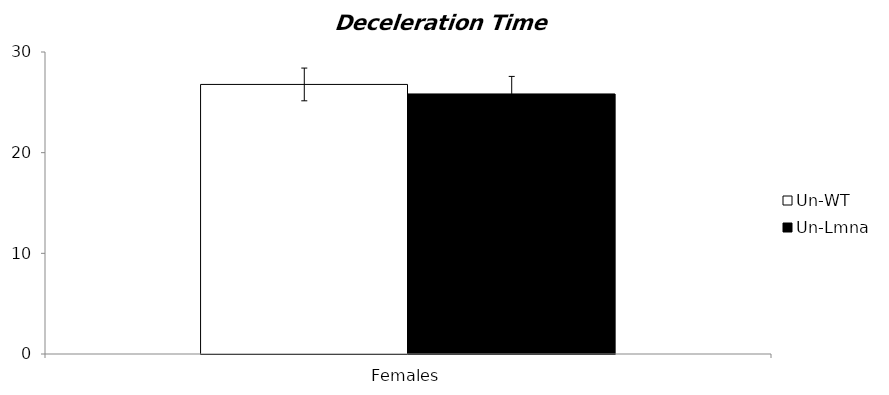
| Category | Un-WT | Un-Lmna |
|---|---|---|
| 0 | 26.778 | 25.833 |